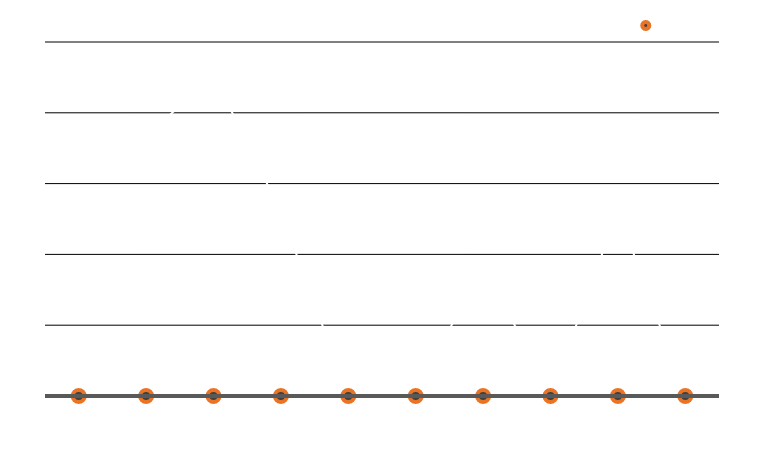
| Category | Пройденное расстояние |
|---|---|
| 5/1/12 | 162 |
| 5/2/12 | 183 |
| 5/3/12 | 227 |
| 5/4/12 | 130 |
| 5/5/12 | 0 |
| 5/6/12 | 0 |
| 5/7/12 | 94 |
| 5/8/12 | 0 |
| 5/9/12 | 131 |
| 5/10/12 | 0 |